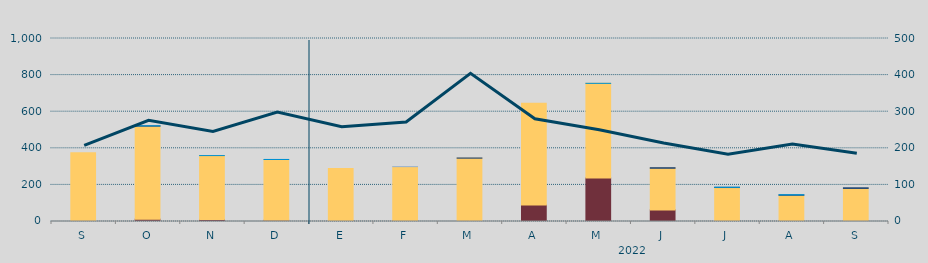
| Category | Carbón | Ciclo Combinado | Cogeneración | Consumo Bombeo | Eólica | Hidráulica | Otras Renovables | Solar fotovoltaica | Solar térmica | Turbinación bombeo | Nuclear |
|---|---|---|---|---|---|---|---|---|---|---|---|
| S | 634 | 375205.9 | 0 | 0 | 0 | 0 | 0 | 0 | 0 | 0 | 0 |
| O | 12750 | 508119.2 | 0 | 1625.9 | 0 | 597.8 | 0 | 0 | 0 | 0 | 0 |
| N | 11251 | 348916.7 | 0 | 0 | 0 | 100 | 0 | 0 | 0 | 0 | 0 |
| D | 6493 | 332239.3 | 0 | 0 | 0 | 335 | 0 | 0 | 0 | 0 | 0 |
| E | 4320 | 285393.5 | 0 | 0 | 0 | 0 | 0 | 0 | 0 | 0 | 0 |
| F | 5118.6 | 294678.7 | 0 | 0 | 0 | 0 | 0 | 0 | 0 | 84.5 | 0 |
| M | 280 | 345584.7 | 0 | 1304.2 | 0 | 0 | 0 | 0 | 0 | 0 | 0 |
| A | 89745.4 | 556069.1 | 0 | 0 | 0 | 0 | 0 | 0 | 0 | 0 | 0 |
| M | 238246.1 | 516625.8 | 0 | 0 | 0 | 170 | 0 | 0 | 0 | 0 | 0 |
| J | 63431.6 | 227120.9 | 0 | 3696.9 | 0 | 0 | 0 | 0 | 0 | 0 | 0 |
| J | 347.9 | 185242.2 | 0 | 1000 | 0 | 958 | 0 | 0 | 0 | 0 | 0 |
| A | 0 | 142890.1 | 241.5 | 1836 | 0 | 1759 | 0 | 0 | 0 | 0 | 0 |
| S | 2508 | 177724.1 | 0 | 4233 | 0 | 0 | 52.5 | 0 | 0 | 0 | 0 |